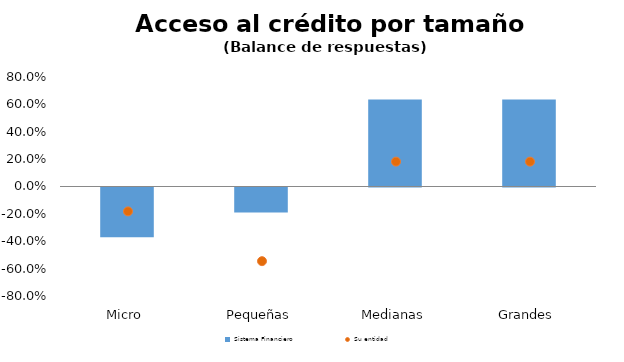
| Category | Sistema Financiero |
|---|---|
| Micro | -0.364 |
| Pequeñas | -0.182 |
| Medianas | 0.636 |
| Grandes | 0.636 |